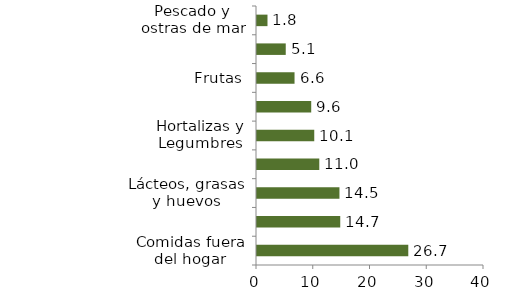
| Category | Alimentos |
|---|---|
| Comidas fuera del hogar | 26.657 |
| Carnes y derivados de la carne | 14.668 |
| Lácteos, grasas y huevos | 14.529 |
| Alimentos varios | 10.976 |
| Hortalizas y Legumbres | 10.088 |
| Cereales y productos de panadería | 9.553 |
| Frutas | 6.614 |
| Tubérculos y plátanos | 5.065 |
| Pescado y ostras de mar | 1.848 |